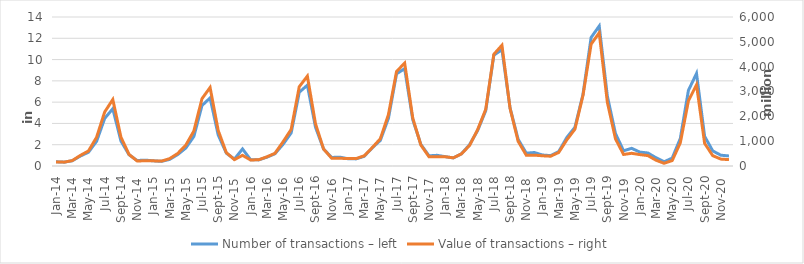
| Category | Number of transactions – left |
|---|---|
| 2014-01-01 | 397343 |
| 2014-02-01 | 361078 |
| 2014-03-01 | 493145 |
| 2014-04-01 | 934003 |
| 2014-05-01 | 1295388 |
| 2014-06-01 | 2322493 |
| 2014-07-01 | 4472930 |
| 2014-08-01 | 5380145 |
| 2014-09-01 | 2354410 |
| 2014-10-01 | 1061057 |
| 2014-11-01 | 515074 |
| 2014-12-01 | 552008 |
| 2015-01-01 | 487873 |
| 2015-02-01 | 434472 |
| 2015-03-01 | 618192 |
| 2015-04-01 | 1071368 |
| 2015-05-01 | 1684681 |
| 2015-06-01 | 2777989 |
| 2015-07-01 | 5680159 |
| 2015-08-01 | 6394748 |
| 2015-09-01 | 2918051 |
| 2015-10-01 | 1209535 |
| 2015-11-01 | 648645 |
| 2015-12-01 | 1601674 |
| 2016-01-01 | 584292 |
| 2016-02-01 | 574917 |
| 2016-03-01 | 823749 |
| 2016-04-01 | 1149524 |
| 2016-05-01 | 2038066 |
| 2016-06-01 | 3106484 |
| 2016-07-01 | 6928007 |
| 2016-08-01 | 7595443 |
| 2016-09-01 | 3649461 |
| 2016-10-01 | 1590986 |
| 2016-11-01 | 802784 |
| 2016-12-01 | 832600 |
| 2017-01-01 | 684062 |
| 2017-02-01 | 667841 |
| 2017-03-01 | 903419 |
| 2017-04-01 | 1701419 |
| 2017-05-01 | 2408336 |
| 2017-06-01 | 4486057 |
| 2017-07-01 | 8663549 |
| 2017-08-01 | 9142665 |
| 2017-09-01 | 4345036 |
| 2017-10-01 | 2028244 |
| 2017-11-01 | 958090 |
| 2017-12-01 | 1004475 |
| 2018-01-01 | 877554 |
| 2018-02-01 | 761371 |
| 2018-03-01 | 1143138 |
| 2018-04-01 | 1996709 |
| 2018-05-01 | 3328942 |
| 2018-06-01 | 5198448 |
| 2018-07-01 | 10409271 |
| 2018-08-01 | 10932790 |
| 2018-09-01 | 5457745 |
| 2018-10-01 | 2502920 |
| 2018-11-01 | 1207090 |
| 2018-12-01 | 1267869 |
| 2019-01-01 | 1030317 |
| 2019-02-01 | 978277 |
| 2019-03-01 | 1348516 |
| 2019-04-01 | 2678504 |
| 2019-05-01 | 3636139 |
| 2019-06-01 | 6740954 |
| 2019-07-01 | 12076123 |
| 2019-08-01 | 13149487 |
| 2019-09-01 | 6567510 |
| 2019-10-01 | 3056294 |
| 2019-11-01 | 1430865 |
| 2019-12-01 | 1661546 |
| 2020-01-01 | 1308423 |
| 2020-02-01 | 1222881 |
| 2020-03-01 | 778166 |
| 2020-04-01 | 397166 |
| 2020-05-01 | 743562 |
| 2020-06-01 | 2581424 |
| 2020-07-01 | 7099623 |
| 2020-08-01 | 8693227 |
| 2020-09-01 | 2787377 |
| 2020-10-01 | 1417314 |
| 2020-11-01 | 1014224 |
| 2020-12-01 | 943660 |